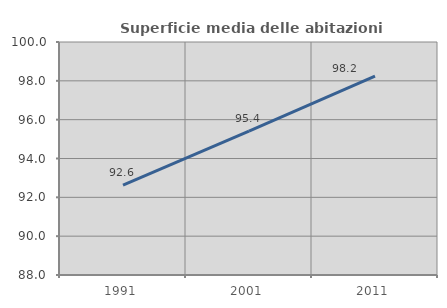
| Category | Superficie media delle abitazioni occupate |
|---|---|
| 1991.0 | 92.631 |
| 2001.0 | 95.407 |
| 2011.0 | 98.243 |